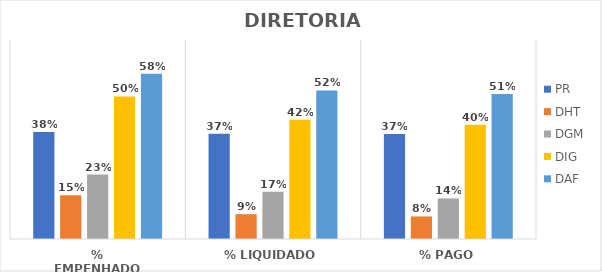
| Category | PR | DHT | DGM | DIG | DAF |
|---|---|---|---|---|---|
| % EMPENHADO | 0.377 | 0.153 | 0.227 | 0.501 | 0.581 |
| % LIQUIDADO | 0.37 | 0.087 | 0.166 | 0.42 | 0.523 |
| % PAGO | 0.369 | 0.079 | 0.143 | 0.402 | 0.51 |